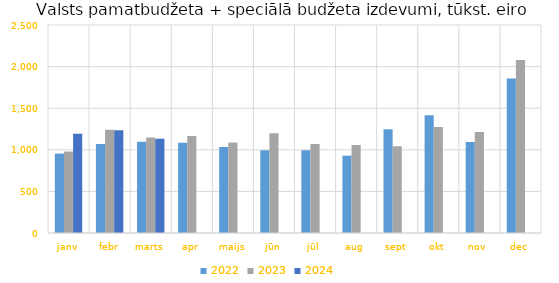
| Category | 2022 | 2023 | 2024 |
|---|---|---|---|
| janv | 954604.585 | 979490.845 | 1193977.049 |
| febr | 1070533.109 | 1241845.152 | 1234636.197 |
| marts | 1096177.665 | 1147758.348 | 1132798.622 |
| apr | 1085060.388 | 1165647.249 | 0 |
| maijs | 1032376.247 | 1086477.037 | 0 |
| jūn | 994027.105 | 1200332.508 | 0 |
| jūl | 994781.699 | 1069038.771 | 0 |
| aug | 929865.805 | 1059055.24 | 0 |
| sept | 1247630.19 | 1042251.968 | 0 |
| okt | 1415572.01 | 1274735.47 | 0 |
| nov | 1092974.61 | 1214492.205 | 0 |
| dec | 1857192.044 | 2078569.315 | 0 |